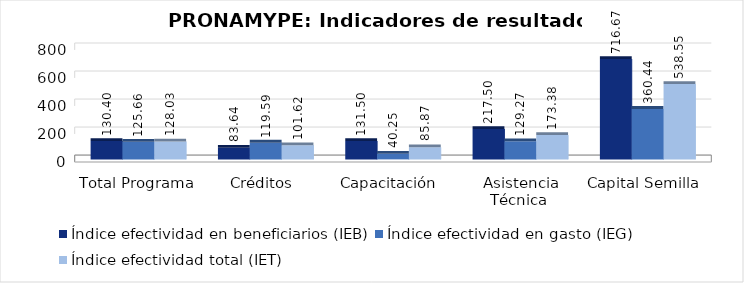
| Category | Índice efectividad en beneficiarios (IEB) | Índice efectividad en gasto (IEG)  | Índice efectividad total (IET) |
|---|---|---|---|
| Total Programa | 130.403 | 125.665 | 128.034 |
| Créditos  | 83.641 | 119.59 | 101.615 |
| Capacitación  | 131.5 | 40.245 | 85.873 |
| Asistencia Técnica  | 217.5 | 129.268 | 173.384 |
| Capital Semilla  | 716.667 | 360.438 | 538.552 |